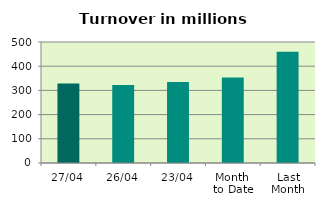
| Category | Series 0 |
|---|---|
| 27/04 | 328.208 |
| 26/04 | 321.806 |
| 23/04 | 334.735 |
| Month 
to Date | 353.105 |
| Last
Month | 459.546 |